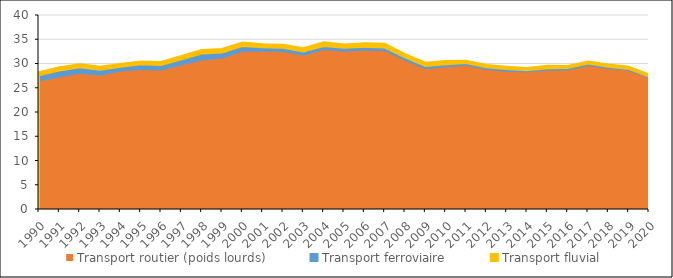
| Category | Transport routier (poids lourds) | Transport ferroviaire | Transport fluvial |
|---|---|---|---|
| 1990.0 | 26.502 | 1.06 | 0.63 |
| 1991.0 | 27.368 | 1.206 | 0.652 |
| 1992.0 | 28.112 | 1.089 | 0.636 |
| 1993.0 | 27.705 | 0.983 | 0.624 |
| 1994.0 | 28.56 | 0.792 | 0.568 |
| 1995.0 | 28.886 | 0.966 | 0.584 |
| 1996.0 | 28.768 | 0.922 | 0.612 |
| 1997.0 | 29.841 | 1.051 | 0.665 |
| 1998.0 | 30.837 | 1.22 | 0.733 |
| 1999.0 | 31.232 | 1.027 | 0.733 |
| 2000.0 | 32.651 | 0.96 | 0.697 |
| 2001.0 | 32.676 | 0.65 | 0.639 |
| 2002.0 | 32.584 | 0.674 | 0.63 |
| 2003.0 | 31.795 | 0.666 | 0.683 |
| 2004.0 | 32.984 | 0.632 | 0.758 |
| 2005.0 | 32.638 | 0.594 | 0.697 |
| 2006.0 | 32.895 | 0.55 | 0.72 |
| 2007.0 | 32.744 | 0.55 | 0.774 |
| 2008.0 | 30.772 | 0.499 | 0.674 |
| 2009.0 | 29.049 | 0.429 | 0.674 |
| 2010.0 | 29.457 | 0.406 | 0.665 |
| 2011.0 | 29.755 | 0.345 | 0.488 |
| 2012.0 | 28.846 | 0.36 | 0.491 |
| 2013.0 | 28.496 | 0.356 | 0.495 |
| 2014.0 | 28.328 | 0.263 | 0.484 |
| 2015.0 | 28.735 | 0.302 | 0.476 |
| 2016.0 | 28.779 | 0.279 | 0.448 |
| 2017.0 | 29.664 | 0.31 | 0.438 |
| 2018.0 | 29.096 | 0.237 | 0.441 |
| 2019.0 | 28.664 | 0.225 | 0.449 |
| 2020.0 | 27.131 | 0.2 | 0.385 |